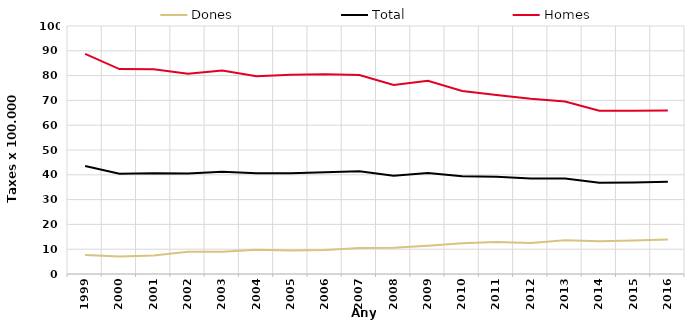
| Category | Dones | Total | Homes |
|---|---|---|---|
| 1999.0 | 7.64 | 43.53 | 88.76 |
| 2000.0 | 7.01 | 40.39 | 82.64 |
| 2001.0 | 7.49 | 40.67 | 82.54 |
| 2002.0 | 8.95 | 40.53 | 80.73 |
| 2003.0 | 8.97 | 41.25 | 82.08 |
| 2004.0 | 9.78 | 40.63 | 79.71 |
| 2005.0 | 9.43 | 40.65 | 80.34 |
| 2006.0 | 9.72 | 40.99 | 80.5 |
| 2007.0 | 10.48 | 41.39 | 80.24 |
| 2008.0 | 10.54 | 39.59 | 76.24 |
| 2009.0 | 11.41 | 40.77 | 77.9 |
| 2010.0 | 12.39 | 39.46 | 73.78 |
| 2011.0 | 12.94 | 39.19 | 72.15 |
| 2012.0 | 12.51 | 38.48 | 70.69 |
| 2013.0 | 13.57 | 38.54 | 69.54 |
| 2014.0 | 13.22 | 36.75 | 65.83 |
| 2015.0 | 13.49 | 36.9 | 65.86 |
| 2016.0 | 13.88 | 37.15 | 65.91 |